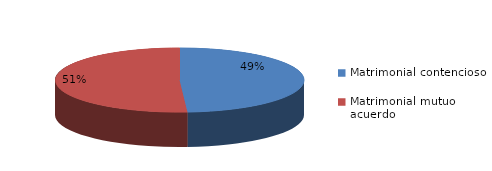
| Category | Series 0 |
|---|---|
| 0 | 948 |
| 1 | 987 |